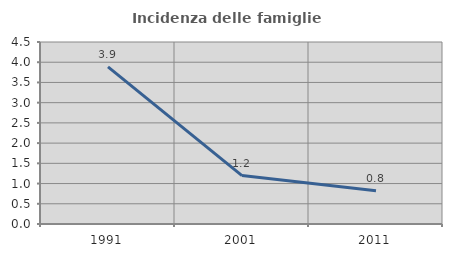
| Category | Incidenza delle famiglie numerose |
|---|---|
| 1991.0 | 3.885 |
| 2001.0 | 1.198 |
| 2011.0 | 0.82 |